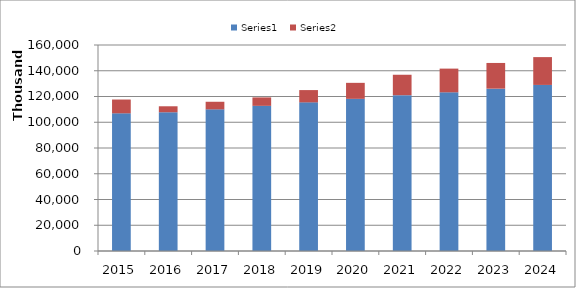
| Category | Series 0 | Series 1 |
|---|---|---|
| 2015.0 | 106936223 | 10715196 |
| 2016.0 | 107765643 | 4643675 |
| 2017.0 | 110014972 | 5894400 |
| 2018.0 | 112748977 | 6545408 |
| 2019.0 | 115439238 | 9545213 |
| 2020.0 | 118194065 | 12412574 |
| 2021.0 | 121015008 | 15876569 |
| 2022.0 | 123248892 | 18412299 |
| 2023.0 | 126083617 | 19971932 |
| 2024.0 | 128983540 | 21615231 |